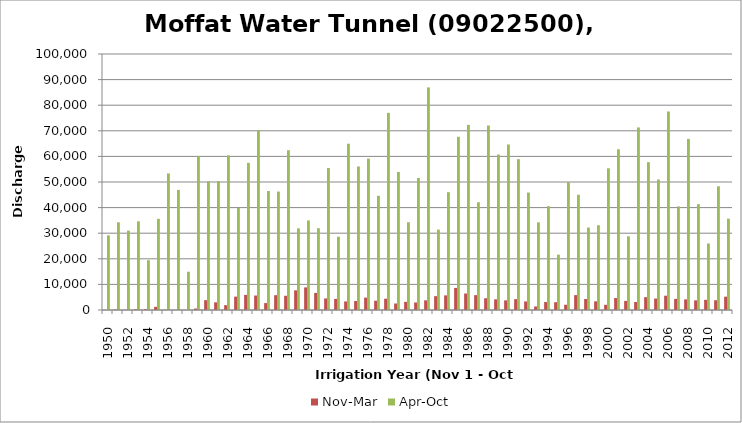
| Category | Nov-Mar | Apr-Oct |
|---|---|---|
| 1950.0 | 4.76 | 29157.45 |
| 1951.0 | 178.71 | 34257.03 |
| 1952.0 | 50.38 | 31008.05 |
| 1953.0 | 289.79 | 34640.84 |
| 1954.0 | 337.99 | 19456.94 |
| 1955.0 | 1247.62 | 35611.75 |
| 1956.0 | 76.76 | 53336.31 |
| 1957.0 | 0 | 46915.92 |
| 1958.0 | 0 | 14955.99 |
| 1959.0 | 583.15 | 60207.74 |
| 1960.0 | 3837.48 | 50304.13 |
| 1961.0 | 3003.22 | 50391.4 |
| 1962.0 | 1894.84 | 60409.48 |
| 1963.0 | 5222.56 | 39884.23 |
| 1964.0 | 5894.97 | 57483.81 |
| 1965.0 | 5661.71 | 70272.22 |
| 1966.0 | 2705.09 | 46477.38 |
| 1967.0 | 5787.86 | 46272.95 |
| 1968.0 | 5557.76 | 62412.81 |
| 1969.0 | 7670.19 | 31888.7 |
| 1970.0 | 8826.57 | 34986.09 |
| 1971.0 | 6670.5 | 31943.08 |
| 1972.0 | 4527.53 | 55448.16 |
| 1973.0 | 4331.97 | 28619.52 |
| 1974.0 | 3344.78 | 64957.63 |
| 1975.0 | 3526.07 | 56061.63 |
| 1976.0 | 4830.81 | 59134.09 |
| 1977.0 | 3625.45 | 44607.12 |
| 1978.0 | 4408.71 | 77007.95 |
| 1979.0 | 2535.5 | 53927.4 |
| 1980.0 | 3192.05 | 34281.66 |
| 1981.0 | 2942.31 | 51556.13 |
| 1982.0 | 3780.55 | 86953.86 |
| 1983.0 | 5406.42 | 31399.21 |
| 1984.0 | 5714.47 | 46023.35 |
| 1985.0 | 8616.33 | 67665.11 |
| 1986.0 | 6446.37 | 72312.44 |
| 1987.0 | 5812.46 | 42087.87 |
| 1988.0 | 4589.21 | 72056.59 |
| 1989.0 | 4168.92 | 60709.01 |
| 1990.0 | 3772.81 | 64656.14 |
| 1991.0 | 4240.12 | 58909.74 |
| 1992.0 | 3352.71 | 45879.36 |
| 1993.0 | 1381.66 | 34254.24 |
| 1994.0 | 3108.16 | 40565.56 |
| 1995.0 | 3044.07 | 21626.5 |
| 1996.0 | 2048.55 | 49907.04 |
| 1997.0 | 5818.99 | 45017.24 |
| 1998.0 | 4293.28 | 32219.44 |
| 1999.0 | 3388.8 | 33112.8 |
| 2000.0 | 2030.5 | 55351.95 |
| 2001.0 | 4669.55 | 62803.16 |
| 2002.0 | 3548.68 | 28779.19 |
| 2003.0 | 3124.81 | 71307.02 |
| 2004.0 | 5008.73 | 57749.6 |
| 2005.0 | 4477.56 | 50966.83 |
| 2006.0 | 5584.74 | 77541.17 |
| 2007.0 | 4362.1 | 40477.28 |
| 2008.0 | 4153.84 | 66831.67 |
| 2009.0 | 3768.64 | 41320.67 |
| 2010.0 | 3976.72 | 25983.75 |
| 2011.0 | 3819.02 | 48322.27 |
| 2012.0 | 5208.68 | 35661.35 |